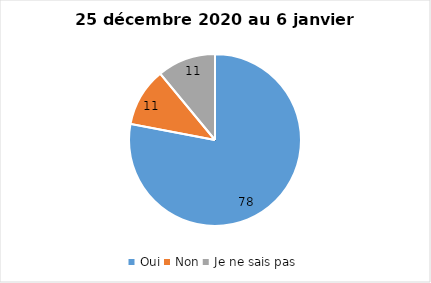
| Category | Series 0 |
|---|---|
| Oui | 78 |
| Non | 11 |
| Je ne sais pas | 11 |